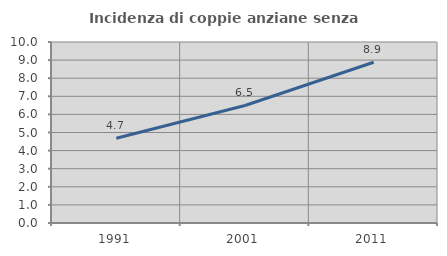
| Category | Incidenza di coppie anziane senza figli  |
|---|---|
| 1991.0 | 4.68 |
| 2001.0 | 6.493 |
| 2011.0 | 8.88 |